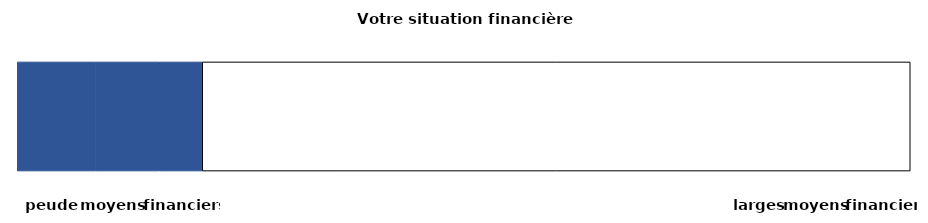
| Category | roerend vermogen | onroerend vermogen | netto-inkomen | spaarmogelijkheid | maximale score |
|---|---|---|---|---|---|
| 0 | 0.088 | 0.071 | 0.048 | 0 | 0.793 |